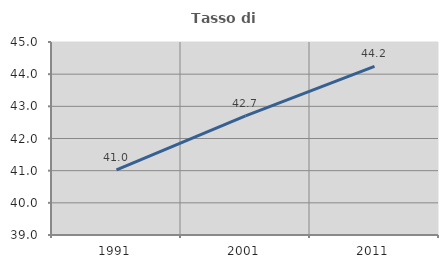
| Category | Tasso di occupazione   |
|---|---|
| 1991.0 | 41.027 |
| 2001.0 | 42.704 |
| 2011.0 | 44.244 |